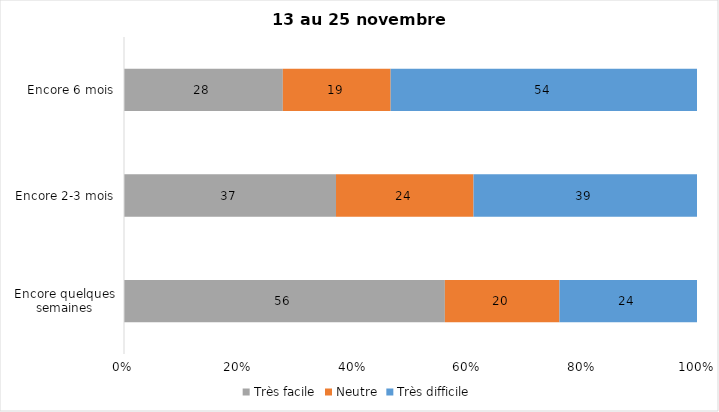
| Category | Très facile | Neutre | Très difficile |
|---|---|---|---|
| Encore quelques semaines | 56 | 20 | 24 |
| Encore 2-3 mois | 37 | 24 | 39 |
| Encore 6 mois | 28 | 19 | 54 |